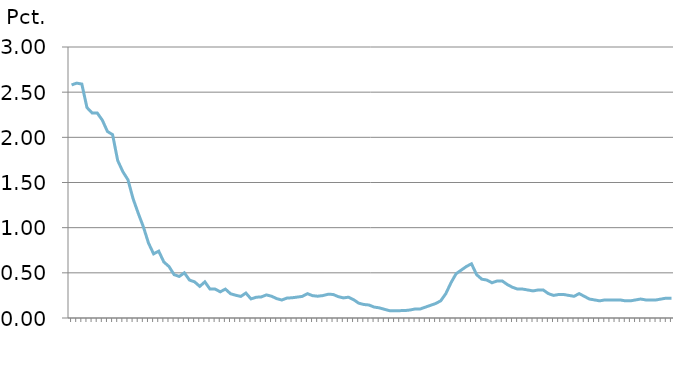
| Category | Restanceprocent |
|---|---|
| nan | 2.58 |
| nan | 2.6 |
| nan | 2.59 |
| 1991.0 | 2.33 |
| nan | 2.27 |
| nan | 2.27 |
| nan | 2.19 |
| 1992.0 | 2.064 |
| nan | 2.03 |
| nan | 1.743 |
| nan | 1.62 |
| 1993.0 | 1.53 |
| nan | 1.32 |
| nan | 1.16 |
| nan | 1.01 |
| 1994.0 | 0.83 |
| nan | 0.71 |
| nan | 0.74 |
| nan | 0.62 |
| 1995.0 | 0.57 |
| nan | 0.48 |
| nan | 0.46 |
| nan | 0.5 |
| 1996.0 | 0.42 |
| nan | 0.4 |
| nan | 0.35 |
| nan | 0.4 |
| 1997.0 | 0.32 |
| nan | 0.32 |
| nan | 0.29 |
| nan | 0.32 |
| 1998.0 | 0.269 |
| nan | 0.252 |
| nan | 0.239 |
| nan | 0.276 |
| 1999.0 | 0.211 |
| nan | 0.23 |
| nan | 0.233 |
| nan | 0.256 |
| 2000.0 | 0.241 |
| nan | 0.215 |
| nan | 0.199 |
| nan | 0.221 |
| 2001.0 | 0.224 |
| nan | 0.231 |
| nan | 0.239 |
| nan | 0.269 |
| 2002.0 | 0.247 |
| nan | 0.241 |
| nan | 0.248 |
| nan | 0.262 |
| 2003.0 | 0.261 |
| nan | 0.237 |
| nan | 0.223 |
| nan | 0.23 |
| 2004.0 | 0.203 |
| nan | 0.164 |
| nan | 0.149 |
| nan | 0.144 |
| 2005.0 | 0.121 |
| nan | 0.112 |
| nan | 0.097 |
| nan | 0.081 |
| 2006.0 | 0.08 |
| nan | 0.082 |
| nan | 0.082 |
| nan | 0.088 |
| 2007.0 | 0.1 |
| nan | 0.1 |
| nan | 0.12 |
| nan | 0.14 |
| 2008.0 | 0.16 |
| nan | 0.19 |
| nan | 0.27 |
| nan | 0.39 |
| 2009.0 | 0.49 |
| nan | 0.53 |
| nan | 0.57 |
| nan | 0.6 |
| 2010.0 | 0.48 |
| nan | 0.43 |
| nan | 0.42 |
| nan | 0.39 |
| 2011.0 | 0.41 |
| nan | 0.41 |
| nan | 0.37 |
| nan | 0.34 |
| 2012.0 | 0.32 |
| nan | 0.32 |
| nan | 0.31 |
| nan | 0.3 |
| 2013.0 | 0.31 |
| nan | 0.31 |
| nan | 0.27 |
| nan | 0.25 |
| 2014.0 | 0.26 |
| nan | 0.26 |
| nan | 0.25 |
| nan | 0.24 |
| 2015.0 | 0.27 |
| nan | 0.24 |
| nan | 0.21 |
| nan | 0.2 |
| 2016.0 | 0.19 |
| nan | 0.2 |
| nan | 0.2 |
| nan | 0.2 |
| 2017.0 | 0.2 |
| nan | 0.19 |
| nan | 0.19 |
| nan | 0.2 |
| 2018.0 | 0.21 |
| nan | 0.2 |
| nan | 0.2 |
| nan | 0.2 |
| 2019.0 | 0.21 |
| nan | 0.22 |
| nan | 0.22 |